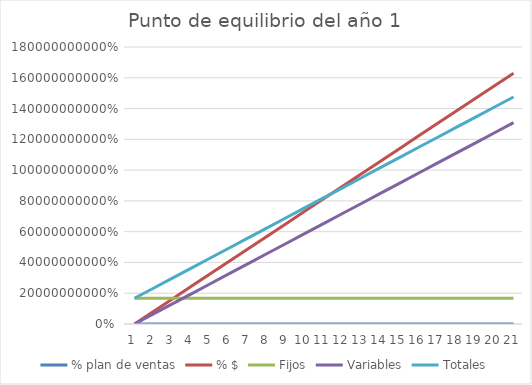
| Category | % plan de ventas | % $ | Fijos | Variables | Totales |
|---|---|---|---|---|---|
| 0 | 0 | 0 | 167122634.062 | 0 | 167122634.062 |
| 1 | 0.05 | 81506250 | 167122634.062 | 65409201.097 | 232531835.159 |
| 2 | 0.1 | 163012500 | 167122634.062 | 130818402.194 | 297941036.256 |
| 3 | 0.15 | 244518750 | 167122634.062 | 196227603.291 | 363350237.354 |
| 4 | 0.2 | 326025000 | 167122634.062 | 261636804.389 | 428759438.451 |
| 5 | 0.25 | 407531250 | 167122634.062 | 327046005.486 | 494168639.548 |
| 6 | 0.3 | 489037500 | 167122634.062 | 392455206.583 | 559577840.645 |
| 7 | 0.35 | 570543750 | 167122634.062 | 457864407.68 | 624987041.742 |
| 8 | 0.4 | 652050000 | 167122634.062 | 523273608.777 | 690396242.839 |
| 9 | 0.45 | 733556250 | 167122634.062 | 588682809.874 | 755805443.936 |
| 10 | 0.5 | 815062500 | 167122634.062 | 654092010.971 | 821214645.034 |
| 11 | 0.55 | 896568750 | 167122634.062 | 719501212.069 | 886623846.131 |
| 12 | 0.6 | 978075000 | 167122634.062 | 784910413.166 | 952033047.228 |
| 13 | 0.65 | 1059581250 | 167122634.062 | 850319614.263 | 1017442248.325 |
| 14 | 0.7 | 1141087500 | 167122634.062 | 915728815.36 | 1082851449.422 |
| 15 | 0.75 | 1222593750 | 167122634.062 | 981138016.457 | 1148260650.519 |
| 16 | 0.8 | 1304100000 | 167122634.062 | 1046547217.554 | 1213669851.616 |
| 17 | 0.85 | 1385606250 | 167122634.062 | 1111956418.651 | 1279079052.714 |
| 18 | 0.9 | 1467112500 | 167122634.062 | 1177365619.749 | 1344488253.811 |
| 19 | 0.95 | 1548618750 | 167122634.062 | 1242774820.846 | 1409897454.908 |
| 20 | 1 | 1630125000 | 167122634.062 | 1308184021.943 | 1475306656.005 |